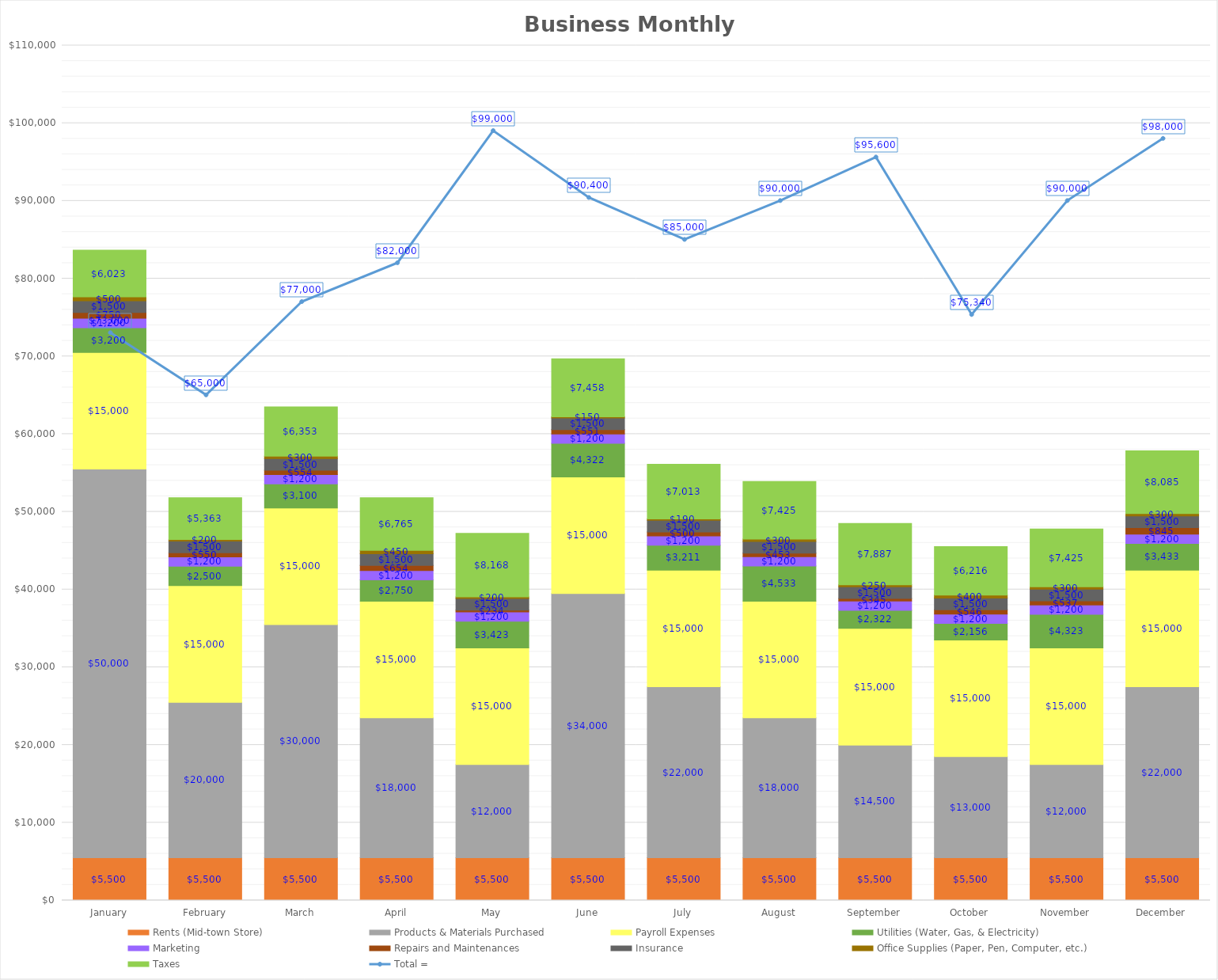
| Category | Rents (Mid-town Store) | Products & Materials Purchased | Payroll Expenses | Utilities (Water, Gas, & Electricity) | Marketing | Repairs and Maintenances | Insurance | Office Supplies (Paper, Pen, Computer, etc.) | Taxes |
|---|---|---|---|---|---|---|---|---|---|
| January | 5500 | 50000 | 15000 | 3200 | 1200 | 750 | 1500 | 500 | 6022.5 |
| February | 5500 | 20000 | 15000 | 2500 | 1200 | 550 | 1500 | 200 | 5362.5 |
| March | 5500 | 30000 | 15000 | 3100 | 1200 | 554 | 1500 | 300 | 6352.5 |
| April | 5500 | 18000 | 15000 | 2750 | 1200 | 654 | 1500 | 450 | 6765 |
| May | 5500 | 12000 | 15000 | 3423 | 1200 | 234 | 1500 | 200 | 8167.5 |
| June | 5500 | 34000 | 15000 | 4322 | 1200 | 551 | 1500 | 150 | 7458 |
| July | 5500 | 22000 | 15000 | 3211 | 1200 | 500 | 1500 | 190 | 7012.5 |
| August | 5500 | 18000 | 15000 | 4533 | 1200 | 453 | 1500 | 300 | 7425 |
| September | 5500 | 14500 | 15000 | 2322 | 1200 | 345 | 1500 | 250 | 7887 |
| October | 5500 | 13000 | 15000 | 2156 | 1200 | 546 | 1500 | 400 | 6215.55 |
| November | 5500 | 12000 | 15000 | 4323 | 1200 | 537 | 1500 | 300 | 7425 |
| December | 5500 | 22000 | 15000 | 3433 | 1200 | 845 | 1500 | 300 | 8085 |